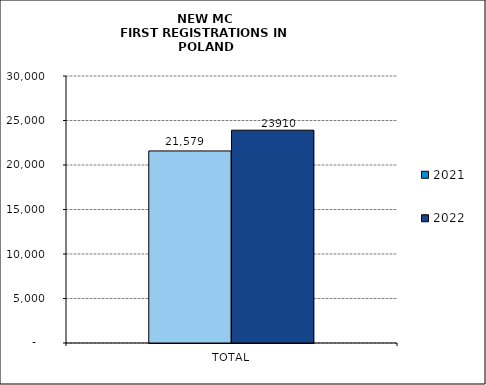
| Category | 2021 | 2022 |
|---|---|---|
| TOTAL | 21579 | 23910 |